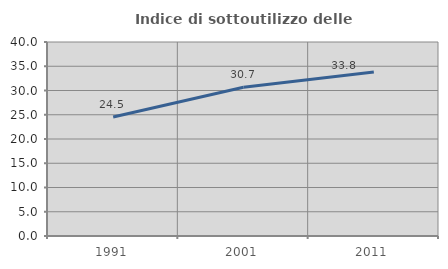
| Category | Indice di sottoutilizzo delle abitazioni  |
|---|---|
| 1991.0 | 24.538 |
| 2001.0 | 30.657 |
| 2011.0 | 33.804 |